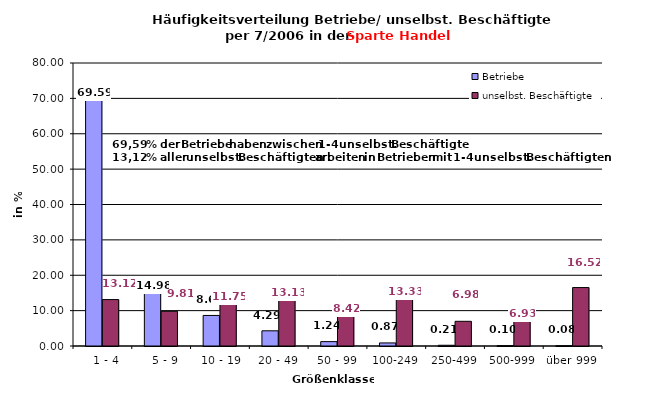
| Category | Betriebe | unselbst. Beschäftigte |
|---|---|---|
|   1 - 4 | 69.591 | 13.123 |
|   5 - 9 | 14.985 | 9.812 |
|  10 - 19 | 8.635 | 11.754 |
| 20 - 49 | 4.295 | 13.128 |
| 50 - 99 | 1.235 | 8.424 |
| 100-249 | 0.866 | 13.331 |
| 250-499 | 0.208 | 6.979 |
| 500-999 | 0.104 | 6.928 |
| über 999 | 0.081 | 16.519 |